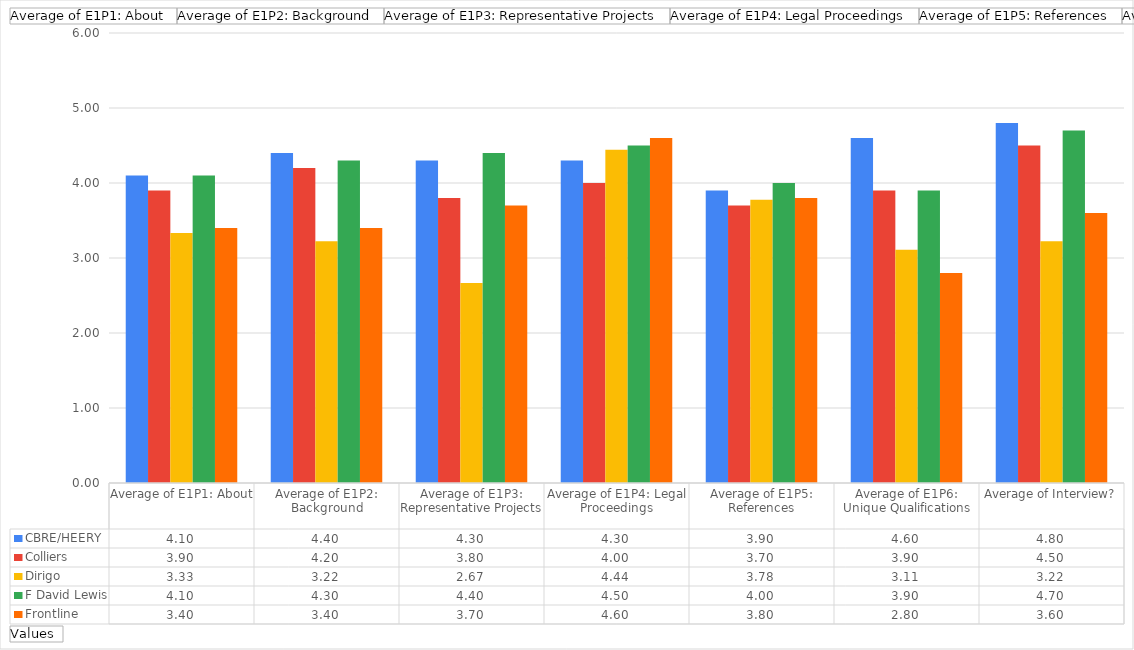
| Category | CBRE/HEERY | Colliers | Dirigo | F David Lewis | Frontline |
|---|---|---|---|---|---|
| Average of E1P1: About | 4.1 | 3.9 | 3.333 | 4.1 | 3.4 |
| Average of E1P2: Background | 4.4 | 4.2 | 3.222 | 4.3 | 3.4 |
| Average of E1P3: Representative Projects | 4.3 | 3.8 | 2.667 | 4.4 | 3.7 |
| Average of E1P4: Legal Proceedings | 4.3 | 4 | 4.444 | 4.5 | 4.6 |
| Average of E1P5: References | 3.9 | 3.7 | 3.778 | 4 | 3.8 |
| Average of E1P6: Unique Qualifications | 4.6 | 3.9 | 3.111 | 3.9 | 2.8 |
| Average of Interview? | 4.8 | 4.5 | 3.222 | 4.7 | 3.6 |